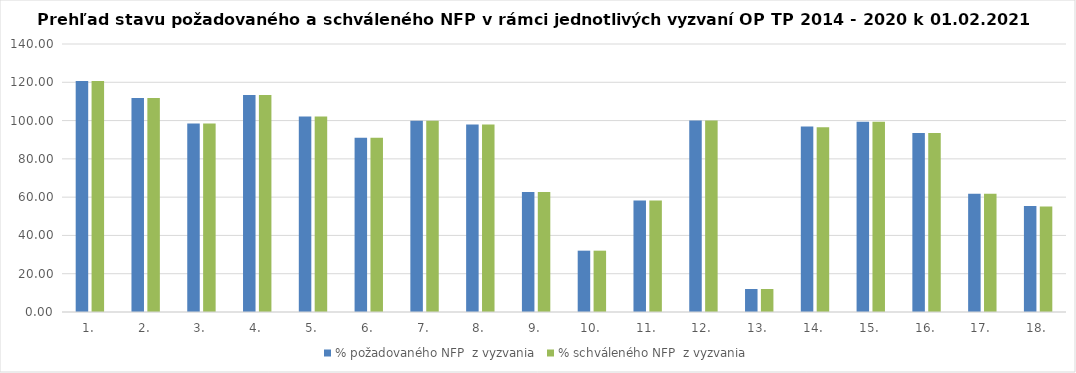
| Category | % požadovaného NFP  z vyzvania | % schváleného NFP  z vyzvania |
|---|---|---|
| 1. | 120.662 | 120.662 |
| 2. | 111.83 | 111.83 |
| 3. | 98.465 | 98.465 |
| 4. | 113.295 | 113.295 |
| 5. | 102.19 | 102.19 |
| 6. | 91.016 | 91.016 |
| 7. | 99.954 | 99.954 |
| 8. | 97.989 | 97.989 |
| 9. | 62.721 | 62.721 |
| 10. | 32.038 | 32.038 |
| 11. | 58.283 | 58.283 |
| 12. | 99.995 | 99.995 |
| 13. | 12.008 | 12.008 |
| 14. | 96.904 | 96.559 |
| 15. | 99.394 | 99.394 |
| 16. | 93.51 | 93.51 |
| 17. | 61.754 | 61.754 |
| 18. | 55.313 | 55.063 |